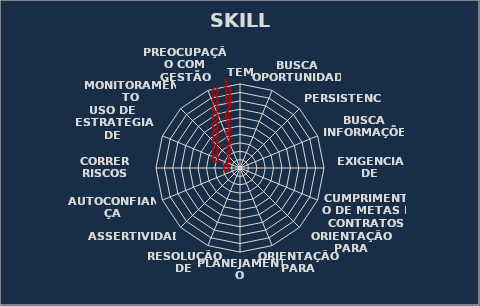
| Category | Series 0 |
|---|---|
| TEM INICIATIVA | 0 |
| BUSCA OPORTUNIDADE | 0 |
| PERSISTENCIA | 0 |
| BUSCA INFORMAÇÕES | 0 |
| EXIGENCIA DE QUALIDADE | 0 |
| CUMPRIMENTO DE METAS E CONTRATOS | 0 |
| ORIENTAÇÃO PARA EFICIENCIA | 0 |
| ORIENTAÇÃO PARA OBJETIVOS | 0 |
| PLANEJAMENTO SISTEMATICO | 0 |
| RESOLUÇÃO DE PROBLEMAS | 0 |
| ASSERTIVIDADE | 0 |
| AUTOCONFIANÇA | 0 |
| CORRER RISCOS MODERADOS | 0 |
| USO DE ESTRATEGIA DE INFLUENCIA | 0 |
| MONITORAMENTO | 0 |
| PREOCUPAÇÃO COM GESTÃO FINANCEIRA | 0 |